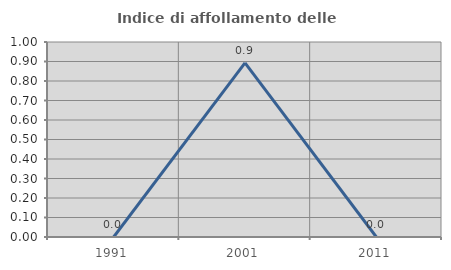
| Category | Indice di affollamento delle abitazioni  |
|---|---|
| 1991.0 | 0 |
| 2001.0 | 0.893 |
| 2011.0 | 0 |